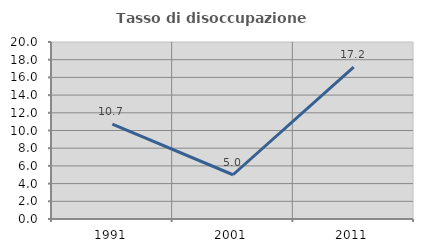
| Category | Tasso di disoccupazione giovanile  |
|---|---|
| 1991.0 | 10.727 |
| 2001.0 | 5 |
| 2011.0 | 17.172 |